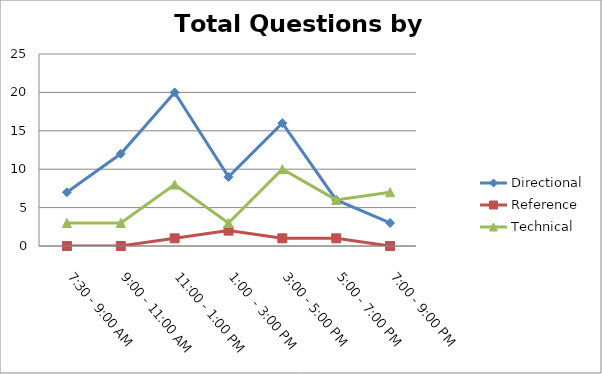
| Category | Directional | Reference | Technical |
|---|---|---|---|
| 7:30 - 9:00 AM | 7 | 0 | 3 |
| 9:00 - 11:00 AM | 12 | 0 | 3 |
| 11:00 - 1:00 PM | 20 | 1 | 8 |
| 1:00  - 3:00 PM | 9 | 2 | 3 |
| 3:00 - 5:00 PM | 16 | 1 | 10 |
| 5:00 - 7:00 PM | 6 | 1 | 6 |
| 7:00 - 9:00 PM | 3 | 0 | 7 |